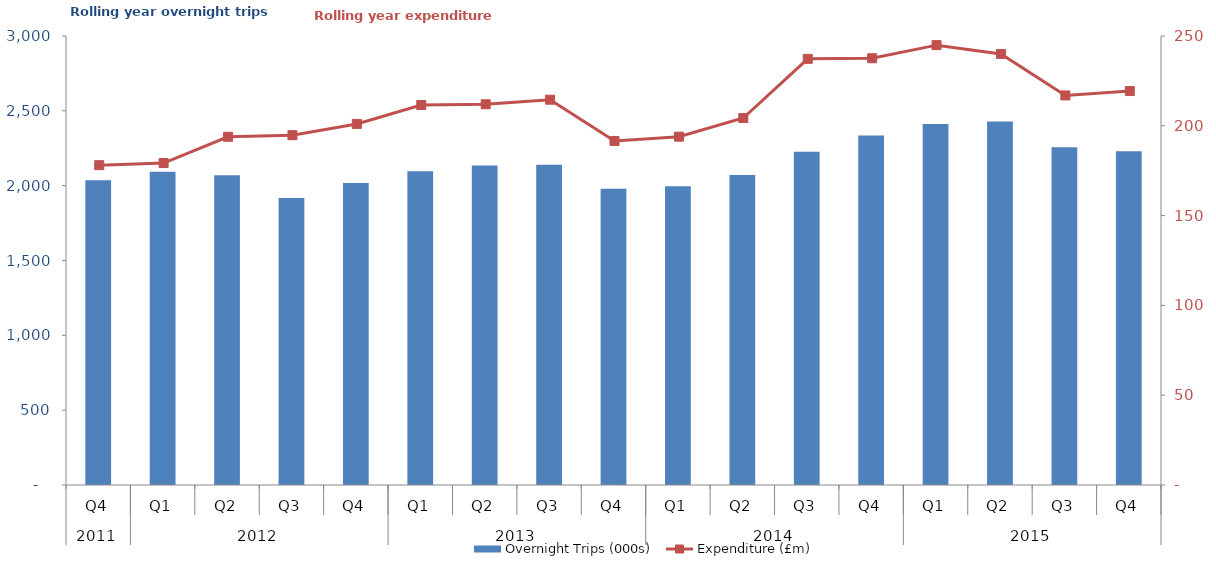
| Category | Overnight Trips (000s) |
|---|---|
| 0 | 2036.136 |
| 1 | 2093.276 |
| 2 | 2068.899 |
| 3 | 1916.896 |
| 4 | 2018.069 |
| 5 | 2095.76 |
| 6 | 2134.636 |
| 7 | 2139.044 |
| 8 | 1980.17 |
| 9 | 1996.066 |
| 10 | 2070.866 |
| 11 | 2226.53 |
| 12 | 2334.627 |
| 13 | 2412.848 |
| 14 | 2429.285 |
| 15 | 2255.913 |
| 16 | 2230.216 |